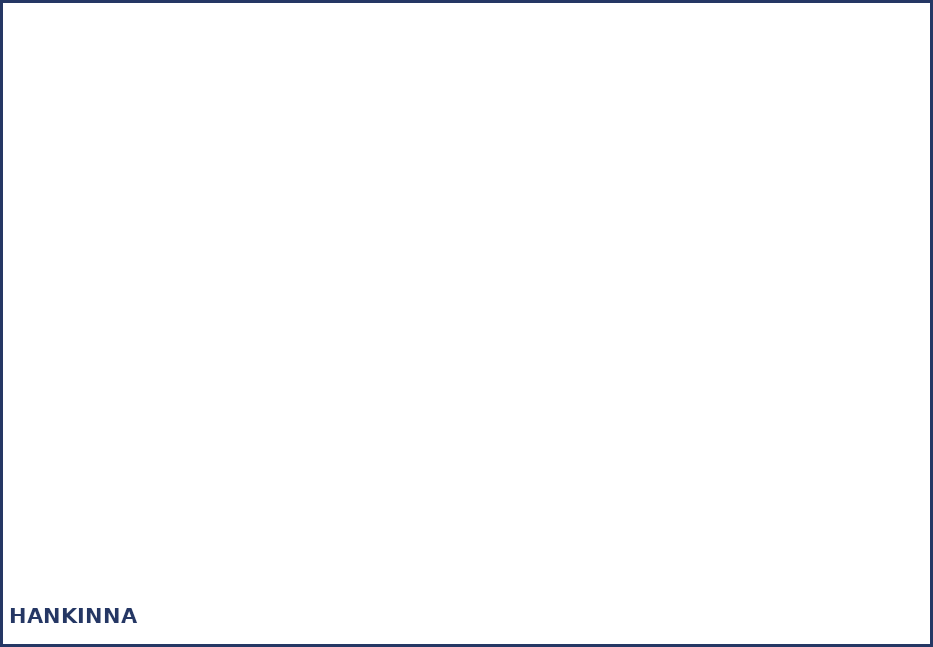
| Category | Series 0 |
|---|---|
| Partiohuivit, vaatteet ja vaatekankaat | 0 |
| Partiomerkit ja ansiomerkit | 0 |
| Teltat ja muut retkeilyvälineet | 0 |
| Askartelu- ja toimistotarvikkeet | 0 |
| Kirjat, lehdet ja esitteet | 0 |
| Lasitavarat, astiat ja keittiötyövälineet | 0 |
| Kodinkoneet ja työkalut | 0 |
| Kalusteet | 0 |
| Puu- ja rautakauppatavara | 0 |
| Ensiaputarvikkeet | 0 |
| Audiovisuaaliset laitteet ja tietokoneet | 0 |
| Palvelut | 0 |
| Muut hankinnat | 0 |